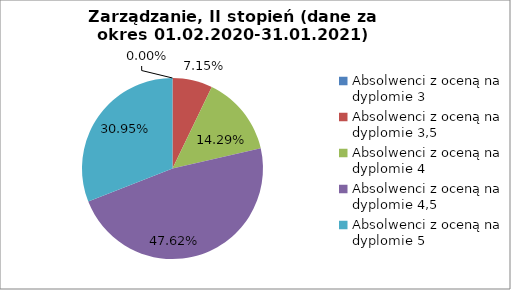
| Category | Series 0 |
|---|---|
| Absolwenci z oceną na dyplomie 3 | 0 |
| Absolwenci z oceną na dyplomie 3,5 | 7.143 |
| Absolwenci z oceną na dyplomie 4 | 14.286 |
| Absolwenci z oceną na dyplomie 4,5 | 47.619 |
| Absolwenci z oceną na dyplomie 5 | 30.952 |